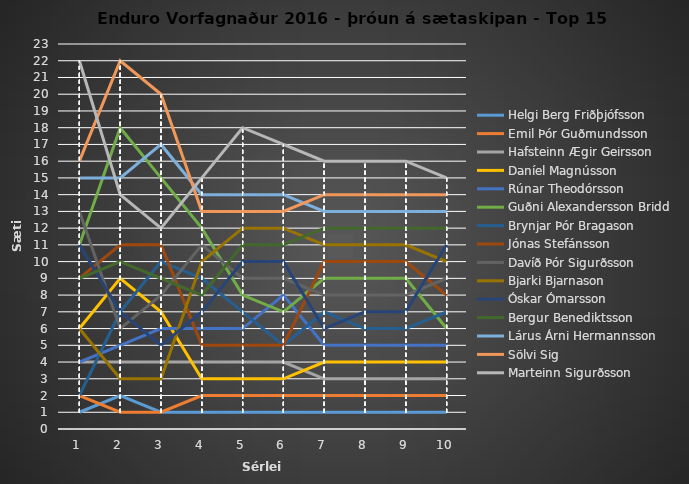
| Category | Helgi Berg Friðþjófsson | Emil Þór Guðmundsson | Hafsteinn Ægir Geirsson | Daníel Magnússon | Rúnar Theodórsson | Guðni Alexandersson Bridd | Brynjar Þór Bragason | Jónas Stefánsson | Davíð Þór Sigurðsson | Bjarki Bjarnason | Óskar Ómarsson | Bergur Benediktsson | Lárus Árni Hermannsson | Sölvi Sig | Marteinn Sigurðsson |
|---|---|---|---|---|---|---|---|---|---|---|---|---|---|---|---|
| 0 | 1 | 2 | 4 | 6 | 4 | 11 | 2 | 9 | 13 | 6 | 11 | 9 | 15 | 16 | 22 |
| 1 | 2 | 1 | 4 | 9 | 5 | 18 | 7 | 11 | 6 | 3 | 7 | 10 | 15 | 22 | 14 |
| 2 | 1 | 1 | 4 | 7 | 6 | 15 | 10 | 11 | 8 | 3 | 5 | 9 | 17 | 20 | 12 |
| 3 | 1 | 2 | 4 | 3 | 6 | 12 | 9 | 5 | 11 | 10 | 7 | 8 | 14 | 13 | 15 |
| 4 | 1 | 2 | 4 | 3 | 6 | 8 | 7 | 5 | 9 | 12 | 10 | 11 | 14 | 13 | 18 |
| 5 | 1 | 2 | 4 | 3 | 8 | 7 | 5 | 5 | 9 | 12 | 10 | 11 | 14 | 13 | 17 |
| 6 | 1 | 2 | 3 | 4 | 5 | 9 | 7 | 10 | 8 | 11 | 6 | 12 | 13 | 14 | 16 |
| 7 | 1 | 2 | 3 | 4 | 5 | 9 | 6 | 10 | 8 | 11 | 7 | 12 | 13 | 14 | 16 |
| 8 | 1 | 2 | 3 | 4 | 5 | 9 | 6 | 10 | 8 | 11 | 7 | 12 | 13 | 14 | 16 |
| 9 | 1 | 2 | 3 | 4 | 5 | 6 | 7 | 8 | 9 | 10 | 11 | 12 | 13 | 14 | 15 |